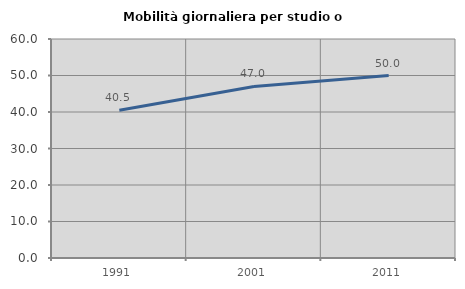
| Category | Mobilità giornaliera per studio o lavoro |
|---|---|
| 1991.0 | 40.476 |
| 2001.0 | 46.988 |
| 2011.0 | 50 |